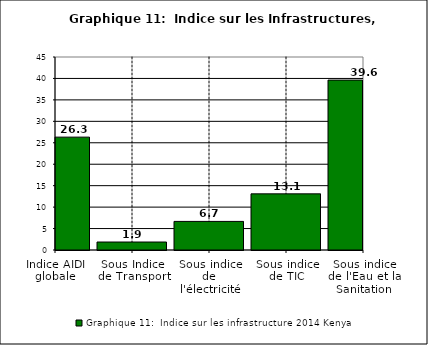
| Category | Graphique 11:  Indice sur les infrastructure 2014 |
|---|---|
| Indice AIDI globale | 26.318 |
| Sous Indice de Transport | 1.859 |
| Sous indice de l'électricité | 6.667 |
| Sous indice de TIC | 13.092 |
| Sous indice de l'Eau et la Sanitation | 39.617 |